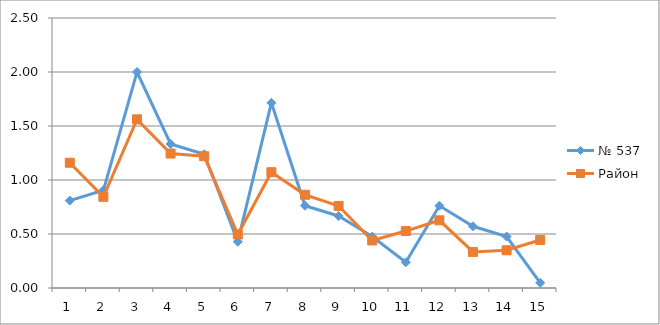
| Category | № 537 | Район |
|---|---|---|
| 0 | 0.81 | 1.16 |
| 1 | 0.905 | 0.844 |
| 2 | 2 | 1.562 |
| 3 | 1.333 | 1.245 |
| 4 | 1.238 | 1.22 |
| 5 | 0.429 | 0.496 |
| 6 | 1.714 | 1.072 |
| 7 | 0.762 | 0.863 |
| 8 | 0.667 | 0.76 |
| 9 | 0.476 | 0.44 |
| 10 | 0.238 | 0.527 |
| 11 | 0.762 | 0.627 |
| 12 | 0.571 | 0.334 |
| 13 | 0.476 | 0.349 |
| 14 | 0.048 | 0.445 |